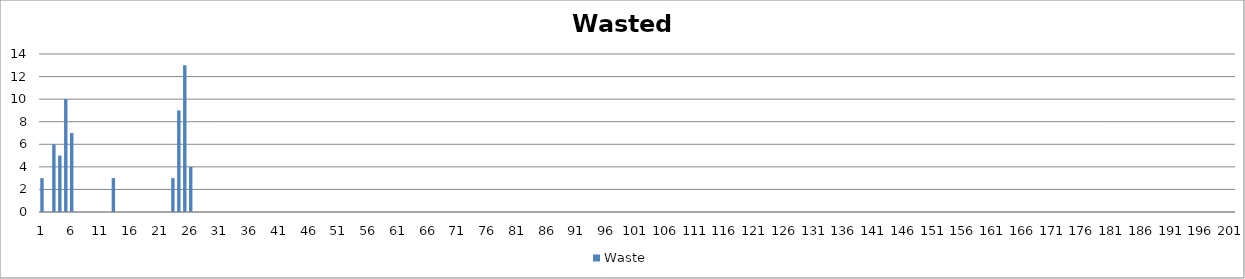
| Category | Waste |
|---|---|
| 0 | 3 |
| 1 | 0 |
| 2 | 6 |
| 3 | 5 |
| 4 | 10 |
| 5 | 7 |
| 6 | 0 |
| 7 | 0 |
| 8 | 0 |
| 9 | 0 |
| 10 | 0 |
| 11 | 0 |
| 12 | 3 |
| 13 | 0 |
| 14 | 0 |
| 15 | 0 |
| 16 | 0 |
| 17 | 0 |
| 18 | 0 |
| 19 | 0 |
| 20 | 0 |
| 21 | 0 |
| 22 | 3 |
| 23 | 9 |
| 24 | 13 |
| 25 | 4 |
| 26 | 0 |
| 27 | 0 |
| 28 | 0 |
| 29 | 0 |
| 30 | 0 |
| 31 | 0 |
| 32 | 0 |
| 33 | 0 |
| 34 | 0 |
| 35 | 0 |
| 36 | 0 |
| 37 | 0 |
| 38 | 0 |
| 39 | 0 |
| 40 | 0 |
| 41 | 0 |
| 42 | 0 |
| 43 | 0 |
| 44 | 0 |
| 45 | 0 |
| 46 | 0 |
| 47 | 0 |
| 48 | 0 |
| 49 | 0 |
| 50 | 0 |
| 51 | 0 |
| 52 | 0 |
| 53 | 0 |
| 54 | 0 |
| 55 | 0 |
| 56 | 0 |
| 57 | 0 |
| 58 | 0 |
| 59 | 0 |
| 60 | 0 |
| 61 | 0 |
| 62 | 0 |
| 63 | 0 |
| 64 | 0 |
| 65 | 0 |
| 66 | 0 |
| 67 | 0 |
| 68 | 0 |
| 69 | 0 |
| 70 | 0 |
| 71 | 0 |
| 72 | 0 |
| 73 | 0 |
| 74 | 0 |
| 75 | 0 |
| 76 | 0 |
| 77 | 0 |
| 78 | 0 |
| 79 | 0 |
| 80 | 0 |
| 81 | 0 |
| 82 | 0 |
| 83 | 0 |
| 84 | 0 |
| 85 | 0 |
| 86 | 0 |
| 87 | 0 |
| 88 | 0 |
| 89 | 0 |
| 90 | 0 |
| 91 | 0 |
| 92 | 0 |
| 93 | 0 |
| 94 | 0 |
| 95 | 0 |
| 96 | 0 |
| 97 | 0 |
| 98 | 0 |
| 99 | 0 |
| 100 | 0 |
| 101 | 0 |
| 102 | 0 |
| 103 | 0 |
| 104 | 0 |
| 105 | 0 |
| 106 | 0 |
| 107 | 0 |
| 108 | 0 |
| 109 | 0 |
| 110 | 0 |
| 111 | 0 |
| 112 | 0 |
| 113 | 0 |
| 114 | 0 |
| 115 | 0 |
| 116 | 0 |
| 117 | 0 |
| 118 | 0 |
| 119 | 0 |
| 120 | 0 |
| 121 | 0 |
| 122 | 0 |
| 123 | 0 |
| 124 | 0 |
| 125 | 0 |
| 126 | 0 |
| 127 | 0 |
| 128 | 0 |
| 129 | 0 |
| 130 | 0 |
| 131 | 0 |
| 132 | 0 |
| 133 | 0 |
| 134 | 0 |
| 135 | 0 |
| 136 | 0 |
| 137 | 0 |
| 138 | 0 |
| 139 | 0 |
| 140 | 0 |
| 141 | 0 |
| 142 | 0 |
| 143 | 0 |
| 144 | 0 |
| 145 | 0 |
| 146 | 0 |
| 147 | 0 |
| 148 | 0 |
| 149 | 0 |
| 150 | 0 |
| 151 | 0 |
| 152 | 0 |
| 153 | 0 |
| 154 | 0 |
| 155 | 0 |
| 156 | 0 |
| 157 | 0 |
| 158 | 0 |
| 159 | 0 |
| 160 | 0 |
| 161 | 0 |
| 162 | 0 |
| 163 | 0 |
| 164 | 0 |
| 165 | 0 |
| 166 | 0 |
| 167 | 0 |
| 168 | 0 |
| 169 | 0 |
| 170 | 0 |
| 171 | 0 |
| 172 | 0 |
| 173 | 0 |
| 174 | 0 |
| 175 | 0 |
| 176 | 0 |
| 177 | 0 |
| 178 | 0 |
| 179 | 0 |
| 180 | 0 |
| 181 | 0 |
| 182 | 0 |
| 183 | 0 |
| 184 | 0 |
| 185 | 0 |
| 186 | 0 |
| 187 | 0 |
| 188 | 0 |
| 189 | 0 |
| 190 | 0 |
| 191 | 0 |
| 192 | 0 |
| 193 | 0 |
| 194 | 0 |
| 195 | 0 |
| 196 | 0 |
| 197 | 0 |
| 198 | 0 |
| 199 | 0 |
| 200 | 0 |